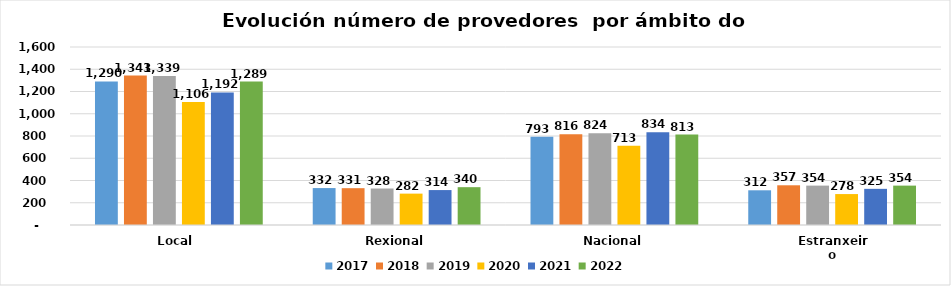
| Category | 2017 | 2018 | 2019 | 2020 | 2021 | 2022 |
|---|---|---|---|---|---|---|
| Local  | 1290 | 1343 | 1339 | 1106 | 1192 | 1289 |
| Rexional | 332 | 331 | 328 | 282 | 314 | 340 |
| Nacional | 793 | 816 | 824 | 713 | 834 | 813 |
| Estranxeiro | 312 | 357 | 354 | 278 | 325 | 354 |